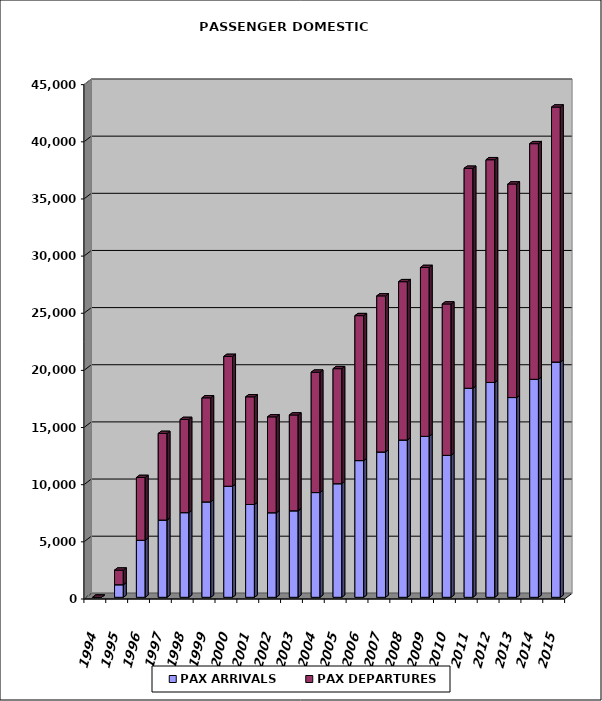
| Category | PAX ARRIVALS | PAX DEPARTURES |
|---|---|---|
| 1994.0 | 0 | 0 |
| 1995.0 | 1100 | 1279 |
| 1996.0 | 4988 | 5495 |
| 1997.0 | 6761 | 7576 |
| 1998.0 | 7408 | 8150 |
| 1999.0 | 8348 | 9105 |
| 2000.0 | 9716 | 11359 |
| 2001.0 | 8121 | 9419 |
| 2002.0 | 7400 | 8387 |
| 2003.0 | 7571 | 8381 |
| 2004.0 | 9164 | 10534 |
| 2005.0 | 9939 | 10065 |
| 2006.0 | 11961 | 12681 |
| 2007.0 | 12714 | 13658 |
| 2008.0 | 13764 | 13849 |
| 2009.0 | 14084 | 14771 |
| 2010.0 | 12419 | 13245 |
| 2011.0 | 18291 | 19243 |
| 2012.0 | 18799 | 19483 |
| 2013.0 | 17477 | 18685 |
| 2014.0 | 19074 | 20612 |
| 2015.0 | 20584 | 22308 |